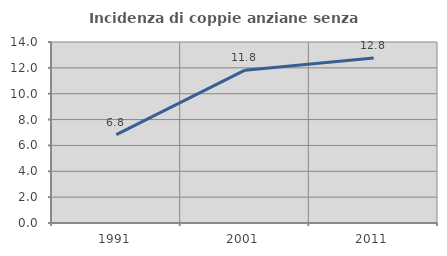
| Category | Incidenza di coppie anziane senza figli  |
|---|---|
| 1991.0 | 6.838 |
| 2001.0 | 11.818 |
| 2011.0 | 12.766 |